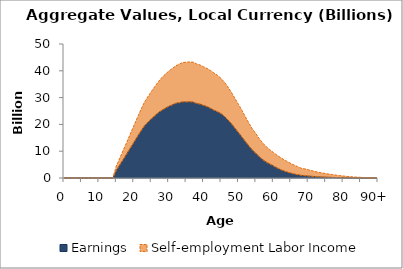
| Category | Earnings | Self-employment Labor Income |
|---|---|---|
| 0 | 0 | 0 |
|  | 0 | 0 |
| 2 | 0 | 0 |
| 3 | 0 | 0 |
| 4 | 0 | 0 |
| 5 | 0 | 0 |
| 6 | 0 | 0 |
| 7 | 0 | 0 |
| 8 | 0 | 0 |
| 9 | 0 | 0 |
| 10 | 0 | 0 |
| 11 | 0 | 0 |
| 12 | 0 | 0 |
| 13 | 0 | 0 |
| 14 | 0 | 0 |
| 15 | 2866.41 | 1645.326 |
| 16 | 4913.049 | 2533.974 |
| 17 | 6969.477 | 3427.344 |
| 18 | 9049.669 | 4331.804 |
| 19 | 11151.386 | 5245.871 |
| 20 | 13257.076 | 6161.265 |
| 21 | 15372.382 | 7080.747 |
| 22 | 17423.089 | 7970.396 |
| 23 | 19340.734 | 8799.634 |
| 24 | 20773.151 | 9492.103 |
| 25 | 22001.387 | 10171.507 |
| 26 | 23173.232 | 10893.502 |
| 27 | 24361.858 | 11479.595 |
| 28 | 25223.379 | 12194.035 |
| 29 | 25977.87 | 12712.344 |
| 30 | 26717.629 | 13123.177 |
| 31 | 27261.668 | 13562.041 |
| 32 | 27860.938 | 13956.575 |
| 33 | 28087.533 | 14373.082 |
| 34 | 28412.599 | 14672.76 |
| 35 | 28362.162 | 14837.054 |
| 36 | 28423.901 | 14886.772 |
| 37 | 28330.28 | 14897.538 |
| 38 | 27813.734 | 14755.519 |
| 39 | 27547.855 | 14610.632 |
| 40 | 27075.207 | 14430.036 |
| 41 | 26644.409 | 14237.455 |
| 42 | 25969.34 | 14140.592 |
| 43 | 25295.885 | 13845.473 |
| 44 | 24705.123 | 13606.543 |
| 45 | 24021.109 | 13134.094 |
| 46 | 22984.892 | 12737.927 |
| 47 | 21653.374 | 12276.379 |
| 48 | 20239.688 | 11668.467 |
| 49 | 18588.146 | 11091.416 |
| 50 | 16966.853 | 10549.123 |
| 51 | 15288.95 | 9952.455 |
| 52 | 13600.981 | 9194.645 |
| 53 | 11933.86 | 8531.939 |
| 54 | 10428.842 | 7870.899 |
| 55 | 9183.756 | 7360.759 |
| 56 | 7925.188 | 6722.315 |
| 57 | 6806.342 | 6191.937 |
| 58 | 5900.628 | 5760.28 |
| 59 | 5208.012 | 5335.886 |
| 60 | 4525.566 | 5035.094 |
| 61 | 3797.257 | 4754.253 |
| 62 | 3157.878 | 4549.067 |
| 63 | 2637.191 | 4227.416 |
| 64 | 2200.011 | 3905.237 |
| 65 | 1807.373 | 3622.302 |
| 66 | 1473.956 | 3309.868 |
| 67 | 1226.959 | 3000.586 |
| 68 | 973.854 | 2668.147 |
| 69 | 851.36 | 2563.335 |
| 70 | 736.179 | 2347.749 |
| 71 | 637.15 | 2115.704 |
| 72 | 533.484 | 1860.974 |
| 73 | 450.217 | 1683.131 |
| 74 | 375.489 | 1495.99 |
| 75 | 311.661 | 1334.807 |
| 76 | 261.918 | 1186.152 |
| 77 | 213.353 | 1040.907 |
| 78 | 168.611 | 891.392 |
| 79 | 127.867 | 770.368 |
| 80 | 93.925 | 657.347 |
| 81 | 67.965 | 537.088 |
| 82 | 52.164 | 431.517 |
| 83 | 36.766 | 348.615 |
| 84 | 25.3 | 282.597 |
| 85 | 16.365 | 224.019 |
| 86 | 9.718 | 173.502 |
| 87 | 0 | 137.054 |
| 88 | 0 | 100.595 |
| 89 | 0 | 72.342 |
| 90+ | 0 | 157.067 |